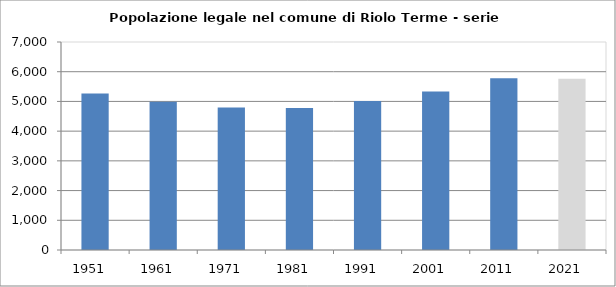
| Category | Popolazione residente |
|---|---|
| 1951   | 5269 |
| 1961   | 4993 |
| 1971   | 4794 |
| 1981   | 4778 |
| 1991   | 5013 |
| 2001   | 5336 |
| 2011   | 5777 |
| 2021   | 5767 |